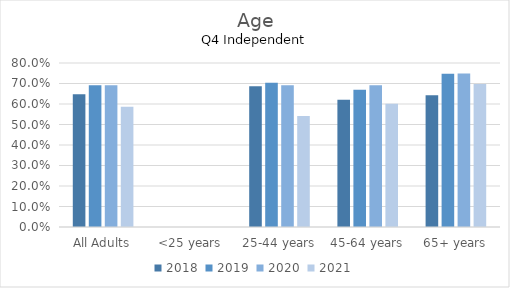
| Category | 2018 | 2019 | 2020 | 2021 |
|---|---|---|---|---|
| All Adults | 0.648 | 0.691 | 0.691 | 0.587 |
| <25 years | 0 | 0 | 0 | 0 |
| 25-44 years | 0.686 | 0.704 | 0.692 | 0.542 |
| 45-64 years | 0.621 | 0.67 | 0.692 | 0.601 |
| 65+ years | 0.643 | 0.748 | 0.749 | 0.697 |